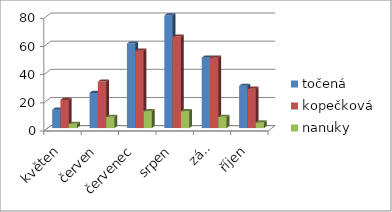
| Category | točená | kopečková | nanuky |
|---|---|---|---|
| květen | 13 | 20 | 3 |
| červen | 25 | 33 | 8 |
| červenec | 60 | 55 | 12 |
| srpen | 80 | 65 | 12 |
| září | 50 | 50 | 8 |
| říjen | 30 | 28 | 4 |